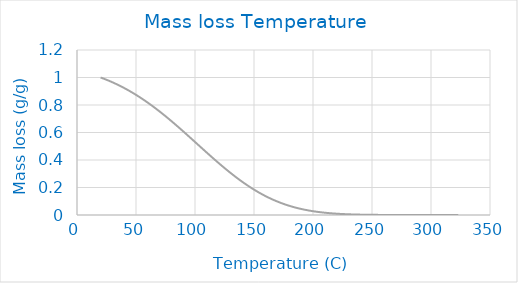
| Category | g/g |
|---|---|
| 20.004478 | 1 |
| 20.99651 | 0.997 |
| 21.996464 | 0.994 |
| 22.99642 | 0.99 |
| 23.996374 | 0.987 |
| 24.99633 | 0.984 |
| 25.996284 | 0.98 |
| 26.996239 | 0.976 |
| 27.996193 | 0.973 |
| 28.996145 | 0.969 |
| 29.996099 | 0.965 |
| 30.996052 | 0.961 |
| 31.996004 | 0.958 |
| 32.995956 | 0.954 |
| 33.995911 | 0.949 |
| 34.995861 | 0.945 |
| 35.995815 | 0.941 |
| 36.995766 | 0.937 |
| 37.99572 | 0.932 |
| 38.99567 | 0.928 |
| 39.995621 | 0.923 |
| 40.995575 | 0.919 |
| 41.995525 | 0.914 |
| 42.99548 | 0.909 |
| 43.99543 | 0.904 |
| 44.995384 | 0.9 |
| 45.995335 | 0.895 |
| 46.995289 | 0.89 |
| 47.995239 | 0.884 |
| 48.995193 | 0.879 |
| 49.995144 | 0.874 |
| 50.995098 | 0.869 |
| 51.995052 | 0.863 |
| 52.995007 | 0.858 |
| 53.994961 | 0.852 |
| 54.994915 | 0.846 |
| 55.994873 | 0.841 |
| 56.994827 | 0.835 |
| 57.994781 | 0.829 |
| 58.99474 | 0.823 |
| 59.994698 | 0.817 |
| 60.994656 | 0.811 |
| 61.994614 | 0.805 |
| 62.994572 | 0.798 |
| 63.994534 | 0.792 |
| 64.994492 | 0.786 |
| 65.994453 | 0.779 |
| 66.994415 | 0.773 |
| 67.994377 | 0.766 |
| 68.994347 | 0.76 |
| 69.994308 | 0.753 |
| 70.994278 | 0.746 |
| 71.99424 | 0.739 |
| 72.994209 | 0.732 |
| 73.994179 | 0.726 |
| 74.994148 | 0.719 |
| 75.994118 | 0.712 |
| 76.994095 | 0.704 |
| 77.994064 | 0.697 |
| 78.994041 | 0.69 |
| 79.994019 | 0.683 |
| 80.993996 | 0.676 |
| 81.993973 | 0.668 |
| 82.99395 | 0.661 |
| 83.993935 | 0.654 |
| 84.993919 | 0.646 |
| 85.993896 | 0.639 |
| 86.993889 | 0.631 |
| 87.993874 | 0.624 |
| 88.993858 | 0.616 |
| 89.993851 | 0.608 |
| 90.993843 | 0.601 |
| 91.993835 | 0.593 |
| 92.993828 | 0.585 |
| 93.993828 | 0.578 |
| 94.99382 | 0.57 |
| 95.99382 | 0.562 |
| 96.99382 | 0.555 |
| 97.993828 | 0.547 |
| 98.993828 | 0.539 |
| 99.993835 | 0.531 |
| 100.99384 | 0.523 |
| 101.99385 | 0.516 |
| 102.99387 | 0.508 |
| 103.99387 | 0.5 |
| 104.99389 | 0.492 |
| 105.9939 | 0.485 |
| 106.99393 | 0.477 |
| 107.99394 | 0.469 |
| 108.99397 | 0.461 |
| 109.99399 | 0.454 |
| 110.99401 | 0.446 |
| 111.99404 | 0.438 |
| 112.99406 | 0.431 |
| 113.99409 | 0.423 |
| 114.99413 | 0.415 |
| 115.99416 | 0.408 |
| 116.99419 | 0.4 |
| 117.99423 | 0.393 |
| 118.99426 | 0.385 |
| 119.99431 | 0.378 |
| 120.99435 | 0.371 |
| 121.99438 | 0.363 |
| 122.99443 | 0.356 |
| 123.99448 | 0.349 |
| 124.99452 | 0.342 |
| 125.99457 | 0.335 |
| 126.99462 | 0.328 |
| 127.99467 | 0.321 |
| 128.99472 | 0.314 |
| 129.99478 | 0.307 |
| 130.99483 | 0.3 |
| 131.99489 | 0.293 |
| 132.99493 | 0.287 |
| 133.995 | 0.28 |
| 134.99506 | 0.273 |
| 135.99512 | 0.267 |
| 136.99518 | 0.261 |
| 137.99524 | 0.254 |
| 138.9953 | 0.248 |
| 139.99536 | 0.242 |
| 140.99542 | 0.236 |
| 141.9955 | 0.23 |
| 142.99556 | 0.224 |
| 143.99562 | 0.218 |
| 144.9957 | 0.212 |
| 145.99576 | 0.207 |
| 146.99583 | 0.201 |
| 147.9959 | 0.195 |
| 148.99597 | 0.19 |
| 149.99603 | 0.185 |
| 150.99611 | 0.18 |
| 151.99617 | 0.174 |
| 152.99625 | 0.169 |
| 153.99631 | 0.164 |
| 154.99638 | 0.159 |
| 155.99646 | 0.155 |
| 156.99652 | 0.15 |
| 157.9966 | 0.145 |
| 158.99666 | 0.141 |
| 159.99673 | 0.136 |
| 160.9968 | 0.132 |
| 161.99687 | 0.128 |
| 162.99695 | 0.124 |
| 163.99701 | 0.12 |
| 164.99709 | 0.116 |
| 165.99715 | 0.112 |
| 166.99721 | 0.108 |
| 167.99728 | 0.104 |
| 168.99734 | 0.101 |
| 169.99742 | 0.097 |
| 170.99748 | 0.094 |
| 171.99754 | 0.09 |
| 172.9976 | 0.087 |
| 173.99768 | 0.084 |
| 174.99774 | 0.081 |
| 175.9978 | 0.078 |
| 176.99786 | 0.075 |
| 177.99792 | 0.072 |
| 178.99799 | 0.069 |
| 179.99805 | 0.067 |
| 180.99809 | 0.064 |
| 181.99815 | 0.062 |
| 182.99821 | 0.059 |
| 183.99828 | 0.057 |
| 184.99832 | 0.054 |
| 185.99838 | 0.052 |
| 186.99843 | 0.05 |
| 187.99847 | 0.048 |
| 188.99854 | 0.046 |
| 189.99858 | 0.044 |
| 190.99863 | 0.042 |
| 191.99867 | 0.04 |
| 192.99872 | 0.038 |
| 193.99876 | 0.037 |
| 194.99881 | 0.035 |
| 195.99886 | 0.033 |
| 196.9989 | 0.032 |
| 197.99893 | 0.03 |
| 198.99898 | 0.029 |
| 199.99902 | 0.028 |
| 200.99905 | 0.026 |
| 201.9991 | 0.025 |
| 202.99913 | 0.024 |
| 203.99916 | 0.023 |
| 204.99919 | 0.022 |
| 205.99924 | 0.021 |
| 206.99927 | 0.019 |
| 207.9993 | 0.018 |
| 208.99933 | 0.018 |
| 209.99936 | 0.017 |
| 210.99937 | 0.016 |
| 211.9994 | 0.015 |
| 212.99944 | 0.014 |
| 213.99947 | 0.013 |
| 214.99948 | 0.013 |
| 215.99951 | 0.012 |
| 216.99953 | 0.011 |
| 217.99956 | 0.011 |
| 218.99957 | 0.01 |
| 219.9996 | 0.01 |
| 220.99962 | 0.009 |
| 221.99963 | 0.008 |
| 222.99965 | 0.008 |
| 223.99966 | 0.008 |
| 224.99968 | 0.007 |
| 225.99971 | 0.007 |
| 226.99973 | 0.006 |
| 227.99973 | 0.006 |
| 228.99974 | 0.006 |
| 229.99976 | 0.005 |
| 230.99977 | 0.005 |
| 231.99979 | 0.005 |
| 232.9998 | 0.004 |
| 233.9998 | 0.004 |
| 234.99982 | 0.004 |
| 235.99983 | 0.004 |
| 236.99983 | 0.003 |
| 237.99985 | 0.003 |
| 238.99986 | 0.003 |
| 239.99986 | 0.003 |
| 240.99988 | 0.003 |
| 241.99988 | 0.002 |
| 242.99989 | 0.002 |
| 243.99989 | 0.002 |
| 244.99991 | 0.002 |
| 245.99991 | 0.002 |
| 246.99991 | 0.002 |
| 247.99992 | 0.002 |
| 248.99992 | 0.001 |
| 249.99992 | 0.001 |
| 250.99994 | 0.001 |
| 251.99994 | 0.001 |
| 252.99994 | 0.001 |
| 253.99995 | 0.001 |
| 254.99995 | 0.001 |
| 255.99995 | 0.001 |
| 256.99997 | 0.001 |
| 257.99997 | 0.001 |
| 258.99997 | 0.001 |
| 259.99997 | 0.001 |
| 260.99997 | 0.001 |
| 261.99997 | 0.001 |
| 262.99997 | 0 |
| 263.99997 | 0 |
| 264.99997 | 0 |
| 265.99997 | 0 |
| 266.99997 | 0 |
| 267.99997 | 0 |
| 269.0 | 0 |
| 270.0 | 0 |
| 271.0 | 0 |
| 272.0 | 0 |
| 273.0 | 0 |
| 274.0 | 0 |
| 275.0 | 0 |
| 276.0 | 0 |
| 277.0 | 0 |
| 278.0 | 0 |
| 279.0 | 0 |
| 280.0 | 0 |
| 281.0 | 0 |
| 282.0 | 0 |
| 283.0 | 0 |
| 284.0 | 0 |
| 285.0 | 0 |
| 286.00003 | 0 |
| 287.0 | 0 |
| 288.0 | 0 |
| 289.00003 | 0 |
| 290.00003 | 0 |
| 291.00003 | 0 |
| 292.00006 | 0 |
| 293.00006 | 0 |
| 294.00006 | 0 |
| 295.00009 | 0 |
| 296.00012 | 0 |
| 297.00015 | 0 |
| 298.00015 | 0 |
| 299.00015 | 0 |
| 300.00018 | 0 |
| 301.00015 | 0 |
| 302.00018 | 0 |
| 303.00027 | 0 |
| 304.00031 | 0 |
| 305.00031 | 0 |
| 306.00034 | 0 |
| 307.00037 | 0 |
| 308.00034 | 0 |
| 309.00034 | 0 |
| 310.00034 | 0 |
| 311.00037 | 0 |
| 312.00037 | 0 |
| 313.0004 | 0 |
| 314.00064 | 0 |
| 315.00076 | 0 |
| 316.00079 | 0 |
| 317.00082 | 0 |
| 318.00089 | 0 |
| 319.00095 | 0 |
| 320.00134 | 0 |
| 321.00146 | 0 |
| 322.00162 | 0 |
| 323.00204 | 0 |